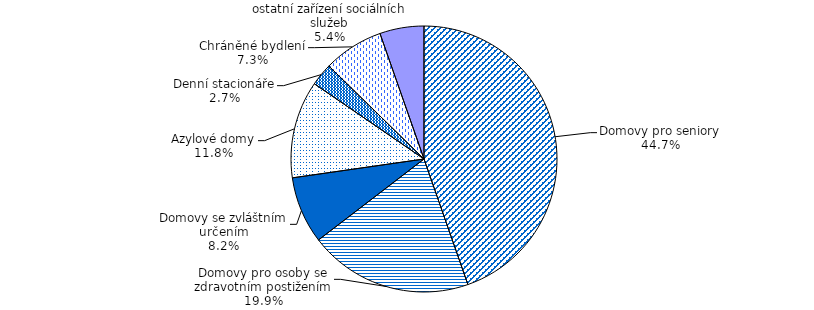
| Category | Series 0 |
|---|---|
| Domovy pro seniory | 2569 |
| Domovy pro osoby se zdravotním postižením | 1147 |
| Domovy se zvláštním určením | 469 |
| Azylové domy | 681 |
| Denní stacionáře | 158 |
| Chráněné bydlení | 421 |
| ostatní zařízení sociálních služeb | 309 |